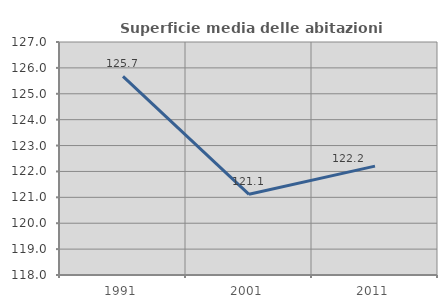
| Category | Superficie media delle abitazioni occupate |
|---|---|
| 1991.0 | 125.671 |
| 2001.0 | 121.118 |
| 2011.0 | 122.207 |